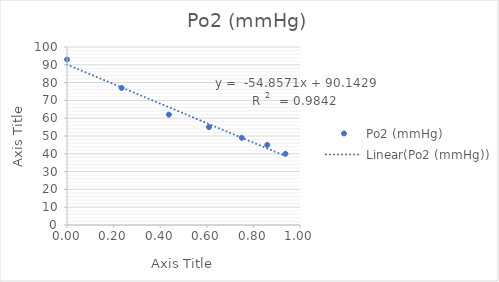
| Category | Po2 (mmHg) |
|---|---|
| 0.9375 | 40 |
| 0.859375 | 45 |
| 0.75 | 49 |
| 0.609375 | 55 |
| 0.4375 | 62 |
| 0.234375 | 77 |
| 0.0 | 93 |